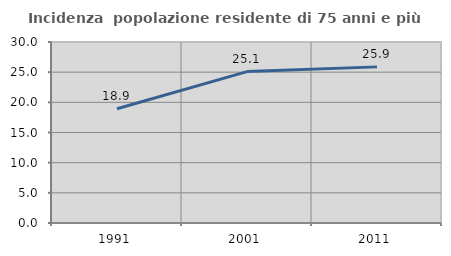
| Category | Incidenza  popolazione residente di 75 anni e più |
|---|---|
| 1991.0 | 18.944 |
| 2001.0 | 25.097 |
| 2011.0 | 25.877 |